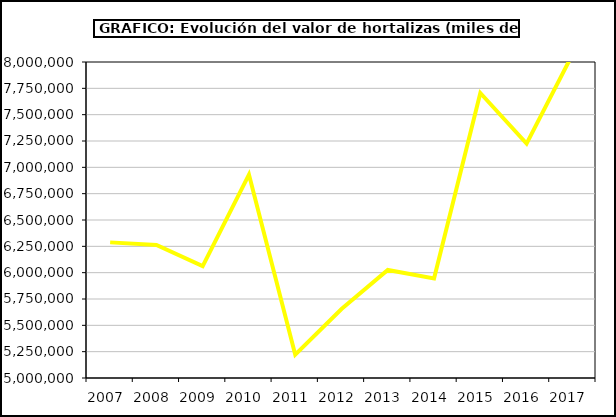
| Category | Valor |
|---|---|
| 2007.0 | 6287554.895 |
| 2008.0 | 6263457.851 |
| 2009.0 | 6061506.811 |
| 2010.0 | 6931312.064 |
| 2011.0 | 5220724.649 |
| 2012.0 | 5654821.085 |
| 2013.0 | 6025736 |
| 2014.0 | 5945397.615 |
| 2015.0 | 7705933 |
| 2016.0 | 7225476.342 |
| 2017.0 | 8079271.573 |